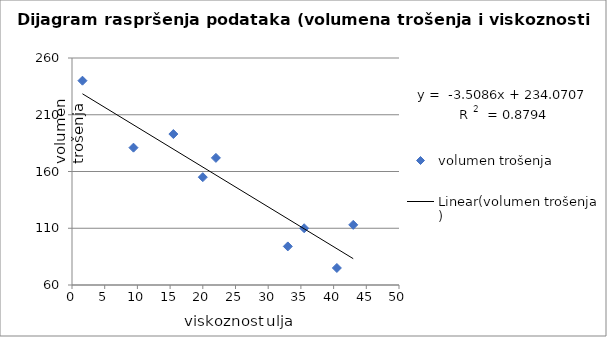
| Category | volumen trošenja  |
|---|---|
| 1.6 | 240 |
| 9.4 | 181 |
| 15.5 | 193 |
| 20.0 | 155 |
| 22.0 | 172 |
| 35.5 | 110 |
| 43.0 | 113 |
| 40.5 | 75 |
| 33.0 | 94 |